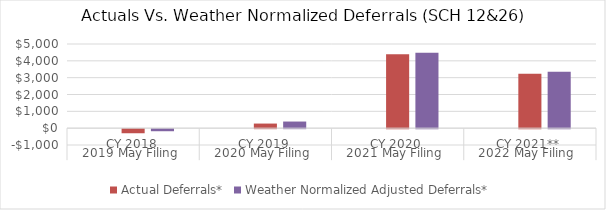
| Category | Residential: SCH 7 | Actual Deferrals* | Weather Normalized Adjusted Deferrals* |
|---|---|---|---|
| 0 |  | -242.518 | -122.578 |
| 1 |  | 273.412 | 393.502 |
| 2 |  | 4387.736 | 4480.078 |
| 3 |  | 3227.748 | 3356.73 |